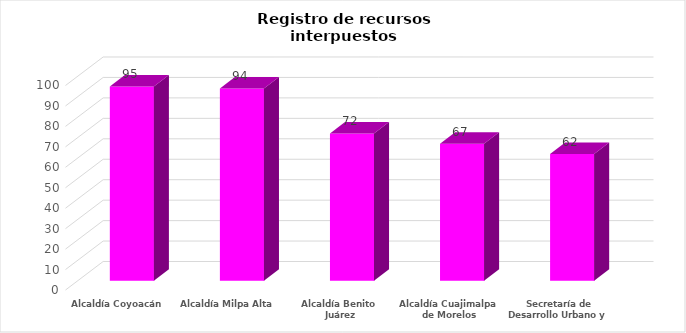
| Category | Registro de recursos interpuestos (IP) |
|---|---|
| Alcaldía Coyoacán | 95 |
| Alcaldía Milpa Alta | 94 |
| Alcaldía Benito Juárez | 72 |
| Alcaldía Cuajimalpa de Morelos | 67 |
| Secretaría de Desarrollo Urbano y Vivienda | 62 |